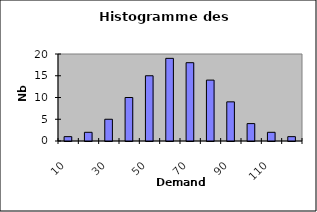
| Category | semaines |
|---|---|
| 10.0 | 1 |
| 20.0 | 2 |
| 30.0 | 5 |
| 40.0 | 10 |
| 50.0 | 15 |
| 60.0 | 19 |
| 70.0 | 18 |
| 80.0 | 14 |
| 90.0 | 9 |
| 100.0 | 4 |
| 110.0 | 2 |
| 120.0 | 1 |